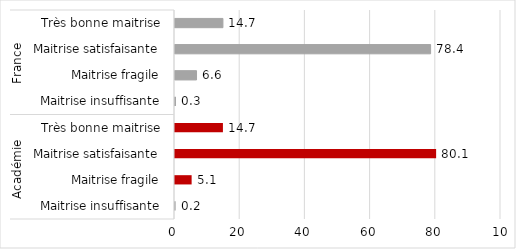
| Category | Series 0 |
|---|---|
| 0 | 0.2 |
| 1 | 5.1 |
| 2 | 80.1 |
| 3 | 14.7 |
| 4 | 0.3 |
| 5 | 6.6 |
| 6 | 78.4 |
| 7 | 14.7 |